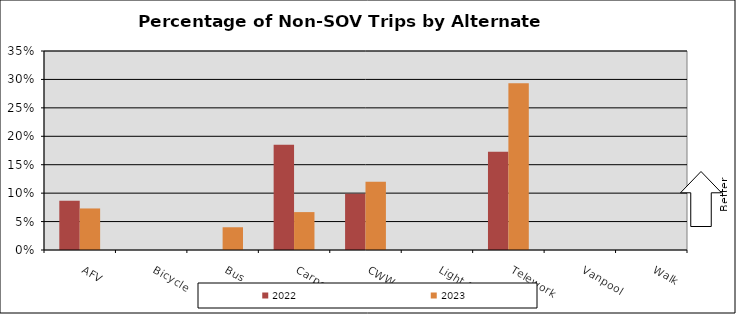
| Category | 2022 | 2023 |
|---|---|---|
| AFV | 0.086 | 0.073 |
| Bicycle | 0 | 0 |
| Bus | 0 | 0.04 |
| Carpool | 0.185 | 0.067 |
| CWW | 0.099 | 0.12 |
| Light Rail | 0 | 0 |
| Telework | 0.173 | 0.293 |
| Vanpool | 0 | 0 |
| Walk | 0 | 0 |